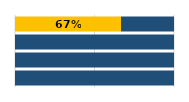
| Category | Niveles de desempeño | Series 1 | Series 2 | Series 3 |
|---|---|---|---|---|
| 0 | 0.667 | 0 | 0 | 0.333 |
| 1 | 0 | 0 | 0 | 1 |
| 2 | 0 | 0 | 0 | 1 |
| 3 | 0 | 0 | 0 | 1 |